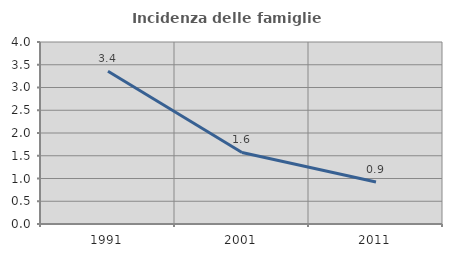
| Category | Incidenza delle famiglie numerose |
|---|---|
| 1991.0 | 3.356 |
| 2001.0 | 1.573 |
| 2011.0 | 0.922 |